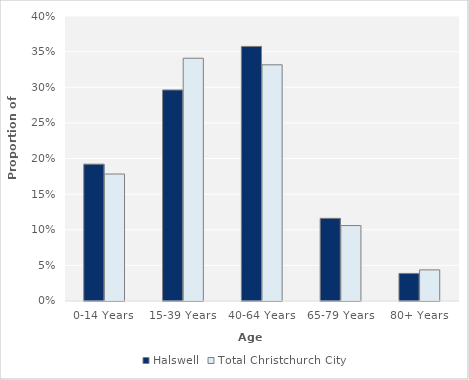
| Category | Halswell | Total Christchurch City |
|---|---|---|
| 0-14 Years | 0.192 | 0.178 |
| 15-39 Years | 0.296 | 0.341 |
| 40-64 Years | 0.357 | 0.331 |
| 65-79 Years | 0.116 | 0.106 |
| 80+ Years | 0.039 | 0.044 |